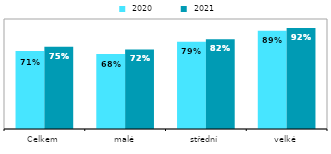
| Category |  2020 |  2021 |
|---|---|---|
| Celkem | 0.71 | 0.747 |
| malé | 0.682 | 0.723 |
| střední | 0.794 | 0.815 |
| velké | 0.893 | 0.918 |